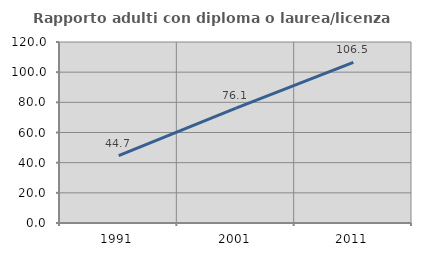
| Category | Rapporto adulti con diploma o laurea/licenza media  |
|---|---|
| 1991.0 | 44.674 |
| 2001.0 | 76.117 |
| 2011.0 | 106.465 |